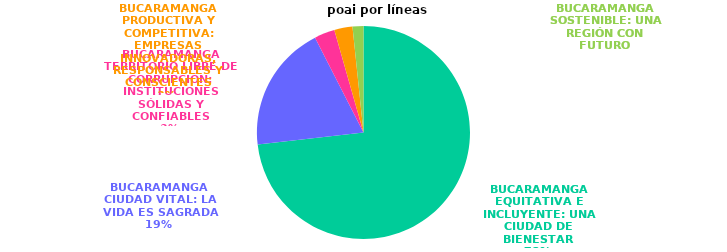
| Category | Series 0 |
|---|---|
| BUCARAMANGA EQUITATIVA E INCLUYENTE: UNA CIUDAD DE BIENESTAR | 706644716027 |
| BUCARAMANGA CIUDAD VITAL: LA VIDA ES SAGRADA | 185964459951.58 |
| BUCARAMANGA TERRITORIO LIBRE DE CORRUPCIÓN: INSTITUCIONES SÓLIDAS Y CONFIABLES | 29922576865.42 |
| BUCARAMANGA PRODUCTIVA Y COMPETITIVA: EMPRESAS INNOVADORAS, RESPONSABLES Y CONSCIENTES | 26699469276 |
| BUCARAMANGA SOSTENIBLE: UNA REGIÓN CON FUTURO | 15923464559 |